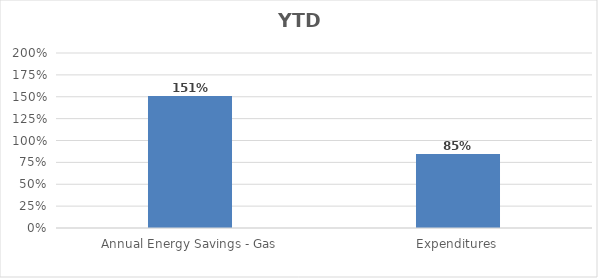
| Category | Series 0 |
|---|---|
| Annual Energy Savings - Gas | 1.508 |
| Expenditures | 0.846 |